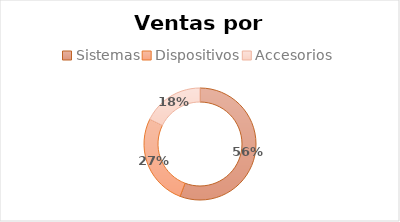
| Category | Total |
|---|---|
| Sistemas | 133642 |
| Dispositivos | 63519 |
| Accesorios | 42372 |